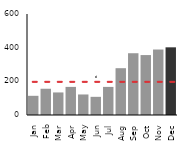
| Category | Tea |
|---|---|
| Jan | 114 |
| Feb | 156 |
| Mar | 134 |
| Apr | 167 |
| May | 122 |
| Jun | 108 |
| Jul | 167 |
| Aug | 278 |
| Sep | 367 |
| Oct | 356 |
| Nov | 389 |
| Dec | 402 |